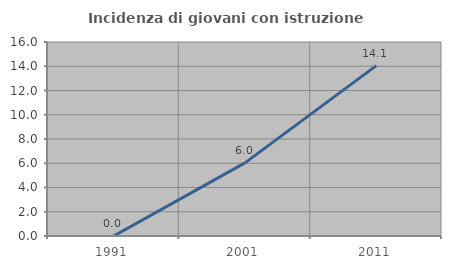
| Category | Incidenza di giovani con istruzione universitaria |
|---|---|
| 1991.0 | 0 |
| 2001.0 | 6.028 |
| 2011.0 | 14.054 |